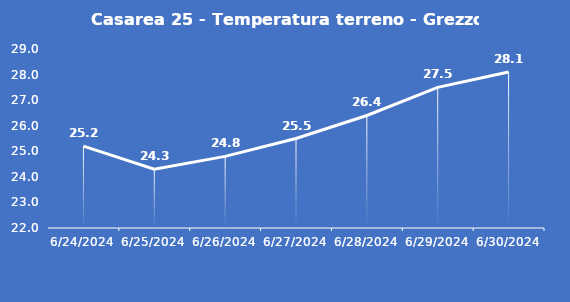
| Category | Casarea 25 - Temperatura terreno - Grezzo (°C) |
|---|---|
| 6/24/24 | 25.2 |
| 6/25/24 | 24.3 |
| 6/26/24 | 24.8 |
| 6/27/24 | 25.5 |
| 6/28/24 | 26.4 |
| 6/29/24 | 27.5 |
| 6/30/24 | 28.1 |